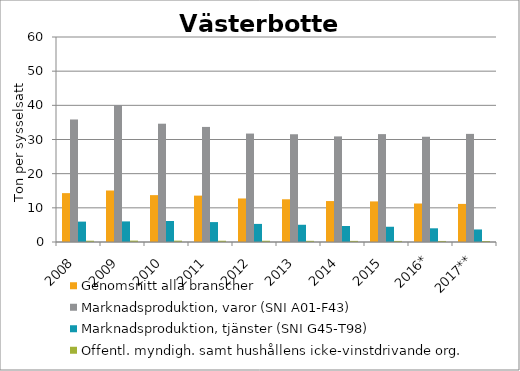
| Category | Genomsnitt alla branscher | Marknadsproduktion, varor (SNI A01-F43) | Marknadsproduktion, tjänster (SNI G45-T98) | Offentl. myndigh. samt hushållens icke-vinstdrivande org. |
|---|---|---|---|---|
| 2008 | 14.303 | 35.862 | 5.967 | 0.374 |
| 2009 | 15.073 | 40.129 | 6.03 | 0.405 |
| 2010 | 13.719 | 34.623 | 6.15 | 0.396 |
| 2011 | 13.574 | 33.681 | 5.827 | 0.368 |
| 2012 | 12.743 | 31.737 | 5.295 | 0.364 |
| 2013 | 12.505 | 31.535 | 5.043 | 0.341 |
| 2014 | 11.983 | 30.906 | 4.675 | 0.324 |
| 2015 | 11.882 | 31.576 | 4.463 | 0.313 |
| 2016* | 11.265 | 30.806 | 4.01 | 0.305 |
| 2017** | 11.149 | 31.643 | 3.67 | 0.291 |